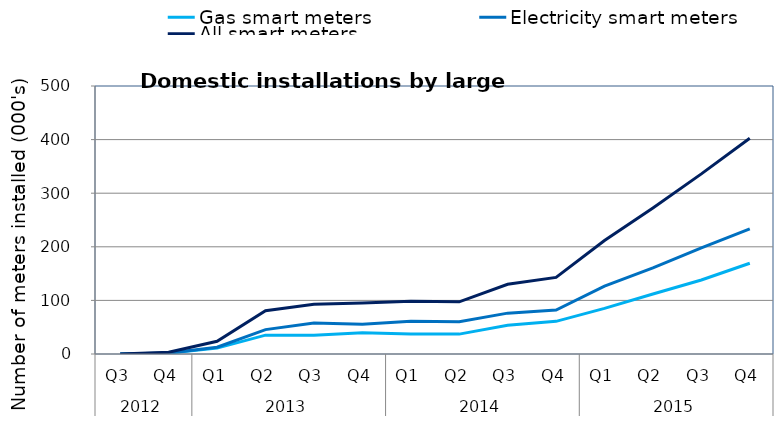
| Category | Gas smart meters | Electricity smart meters | All smart meters |
|---|---|---|---|
| 0 | 32 | 36 | 68 |
| 1 | 1570 | 1671 | 3241 |
| 2 | 10963 | 12678 | 23641 |
| 3 | 35130 | 45456 | 80586 |
| 4 | 35190 | 57632 | 92822 |
| 5 | 39730 | 55603 | 95333 |
| 6 | 37480 | 61164 | 98644 |
| 7 | 37113 | 60216 | 97329 |
| 8 | 53764 | 76227 | 129991 |
| 9 | 60882 | 82081 | 142963 |
| 10 | 85202 | 126515 | 211717 |
| 11 | 112055 | 160543 | 272598 |
| 12 | 138150 | 197911 | 336061 |
| 13 | 169238 | 233400 | 402638 |